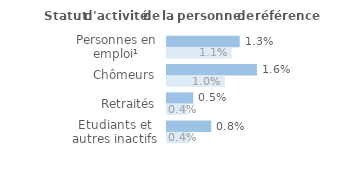
| Category | Series 1 | Series 0 |
|---|---|---|
| Personnes en emploi¹ | 0.013 | 0.011 |
| Chômeurs | 0.016 | 0.01 |
| Retraités | 0.005 | 0.004 |
| Etudiants et autres inactifs | 0.008 | 0.004 |